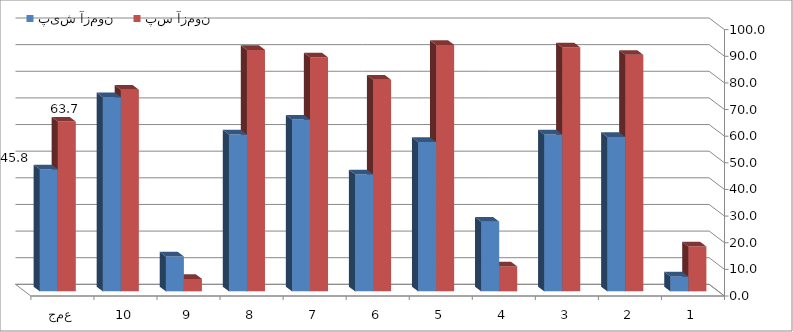
| Category | پیش آزمون | پس آزمون |
|---|---|---|
| 1 | 5.607 | 16.822 |
| 2 | 57.944 | 88.785 |
| 3 | 58.879 | 91.589 |
| 4 | 26.168 | 9.346 |
| 5 | 56.075 | 92.523 |
| 6 | 43.925 | 79.439 |
| 7 | 64.486 | 87.85 |
| 8 | 58.879 | 90.654 |
| 9 | 13.084 | 4.673 |
| 10 | 72.897 | 75.701 |
| جمع | 45.794 | 63.738 |